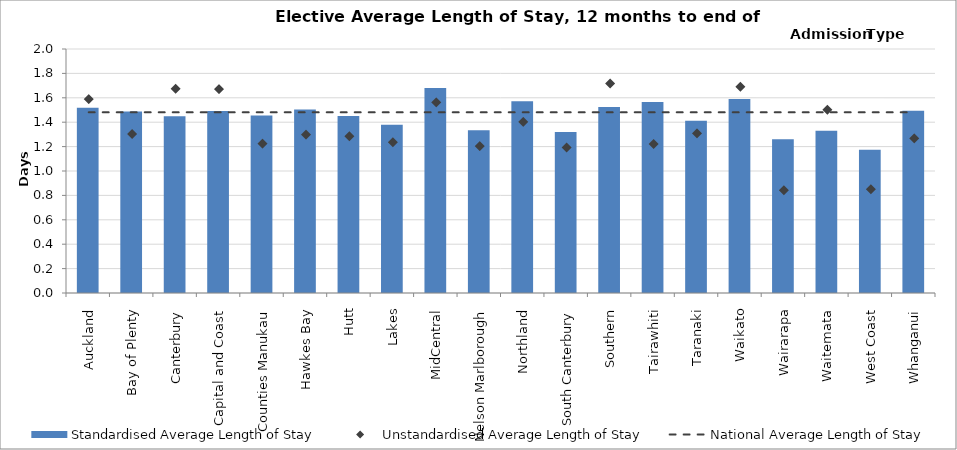
| Category | Standardised Average Length of Stay |
|---|---|
| Auckland | 1.518 |
| Bay of Plenty | 1.488 |
| Canterbury | 1.448 |
| Capital and Coast | 1.492 |
| Counties Manukau | 1.456 |
| Hawkes Bay | 1.503 |
| Hutt | 1.452 |
| Lakes | 1.379 |
| MidCentral | 1.68 |
| Nelson Marlborough | 1.334 |
| Northland | 1.572 |
| South Canterbury | 1.32 |
| Southern | 1.525 |
| Tairawhiti | 1.565 |
| Taranaki | 1.412 |
| Waikato | 1.59 |
| Wairarapa | 1.26 |
| Waitemata | 1.331 |
| West Coast | 1.174 |
| Whanganui | 1.494 |